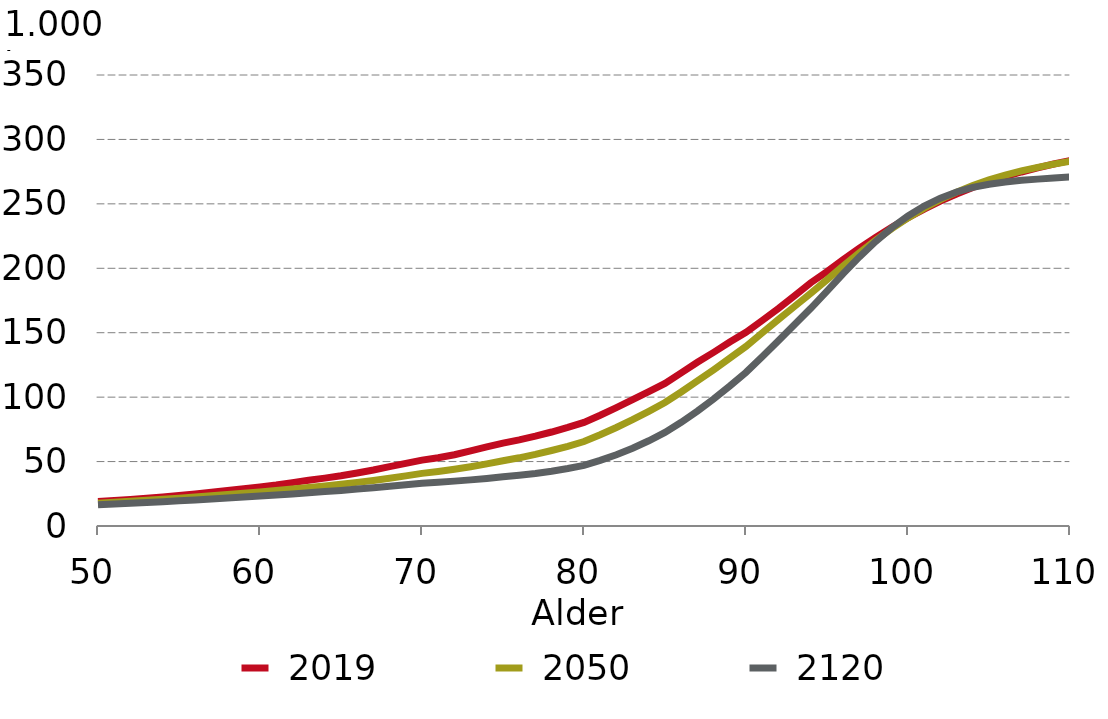
| Category |  2019 |  2050 |  2120 |
|---|---|---|---|
| 50.0 | 18.997 | 17.746 | 16.493 |
| 51.0 | 19.803 | 18.465 | 17.071 |
| 52.0 | 20.619 | 19.209 | 17.664 |
| 53.0 | 21.551 | 19.971 | 18.267 |
| 54.0 | 22.603 | 20.763 | 18.883 |
| 55.0 | 23.739 | 21.585 | 19.509 |
| 56.0 | 24.889 | 22.508 | 20.234 |
| 57.0 | 26.165 | 23.45 | 20.969 |
| 58.0 | 27.615 | 24.415 | 21.715 |
| 59.0 | 28.994 | 25.419 | 22.482 |
| 60.0 | 30.353 | 26.442 | 23.265 |
| 61.0 | 31.864 | 27.528 | 24.083 |
| 62.0 | 33.66 | 28.662 | 24.924 |
| 63.0 | 35.434 | 29.856 | 25.796 |
| 64.0 | 37.17 | 31.085 | 26.694 |
| 65.0 | 38.97 | 32.396 | 27.631 |
| 66.0 | 41.178 | 33.866 | 28.646 |
| 67.0 | 43.431 | 35.378 | 29.689 |
| 68.0 | 46.133 | 37.069 | 30.79 |
| 69.0 | 48.638 | 38.883 | 31.949 |
| 70.0 | 51.096 | 40.829 | 33.176 |
| 71.0 | 52.971 | 42.325 | 33.952 |
| 72.0 | 55.325 | 44.052 | 34.821 |
| 73.0 | 58.35 | 46.033 | 35.8 |
| 74.0 | 61.399 | 48.181 | 36.902 |
| 75.0 | 64.346 | 50.596 | 38.176 |
| 76.0 | 66.842 | 52.918 | 39.365 |
| 77.0 | 69.713 | 55.604 | 40.805 |
| 78.0 | 72.947 | 58.603 | 42.54 |
| 79.0 | 76.493 | 61.88 | 44.607 |
| 80.0 | 80.398 | 65.53 | 47.067 |
| 81.0 | 85.939 | 70.8 | 50.893 |
| 82.0 | 91.829 | 76.453 | 55.302 |
| 83.0 | 98.05 | 82.519 | 60.374 |
| 84.0 | 104.278 | 89.012 | 66.157 |
| 85.0 | 110.591 | 95.824 | 72.621 |
| 86.0 | 118.828 | 103.999 | 80.493 |
| 87.0 | 127.034 | 112.582 | 89.203 |
| 88.0 | 134.752 | 121.235 | 98.556 |
| 89.0 | 142.812 | 130.284 | 108.652 |
| 90.0 | 150.39 | 139.342 | 119.24 |
| 91.0 | 159.492 | 149.85 | 131.421 |
| 92.0 | 168.793 | 160.238 | 143.842 |
| 93.0 | 178.713 | 170.451 | 156.303 |
| 94.0 | 188.793 | 180.585 | 168.914 |
| 95.0 | 197.395 | 191.121 | 182.279 |
| 96.0 | 206.709 | 201.821 | 195.919 |
| 97.0 | 215.588 | 212.083 | 208.859 |
| 98.0 | 224.003 | 221.783 | 220.781 |
| 99.0 | 231.895 | 230.814 | 231.43 |
| 100.0 | 239.221 | 239.097 | 240.63 |
| 101.0 | 245.956 | 246.582 | 248.301 |
| 102.0 | 252.095 | 253.249 | 254.46 |
| 103.0 | 257.648 | 259.111 | 259.214 |
| 104.0 | 262.643 | 264.205 | 262.739 |
| 105.0 | 267.118 | 268.593 | 265.259 |
| 106.0 | 271.124 | 272.353 | 267.017 |
| 107.0 | 274.719 | 275.576 | 268.256 |
| 108.0 | 277.964 | 278.357 | 269.193 |
| 109.0 | 280.922 | 280.793 | 270.015 |
| 110.0 | 283.655 | 282.977 | 270.87 |